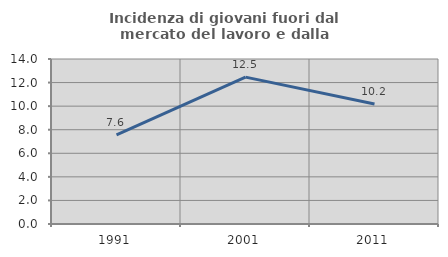
| Category | Incidenza di giovani fuori dal mercato del lavoro e dalla formazione  |
|---|---|
| 1991.0 | 7.57 |
| 2001.0 | 12.46 |
| 2011.0 | 10.187 |